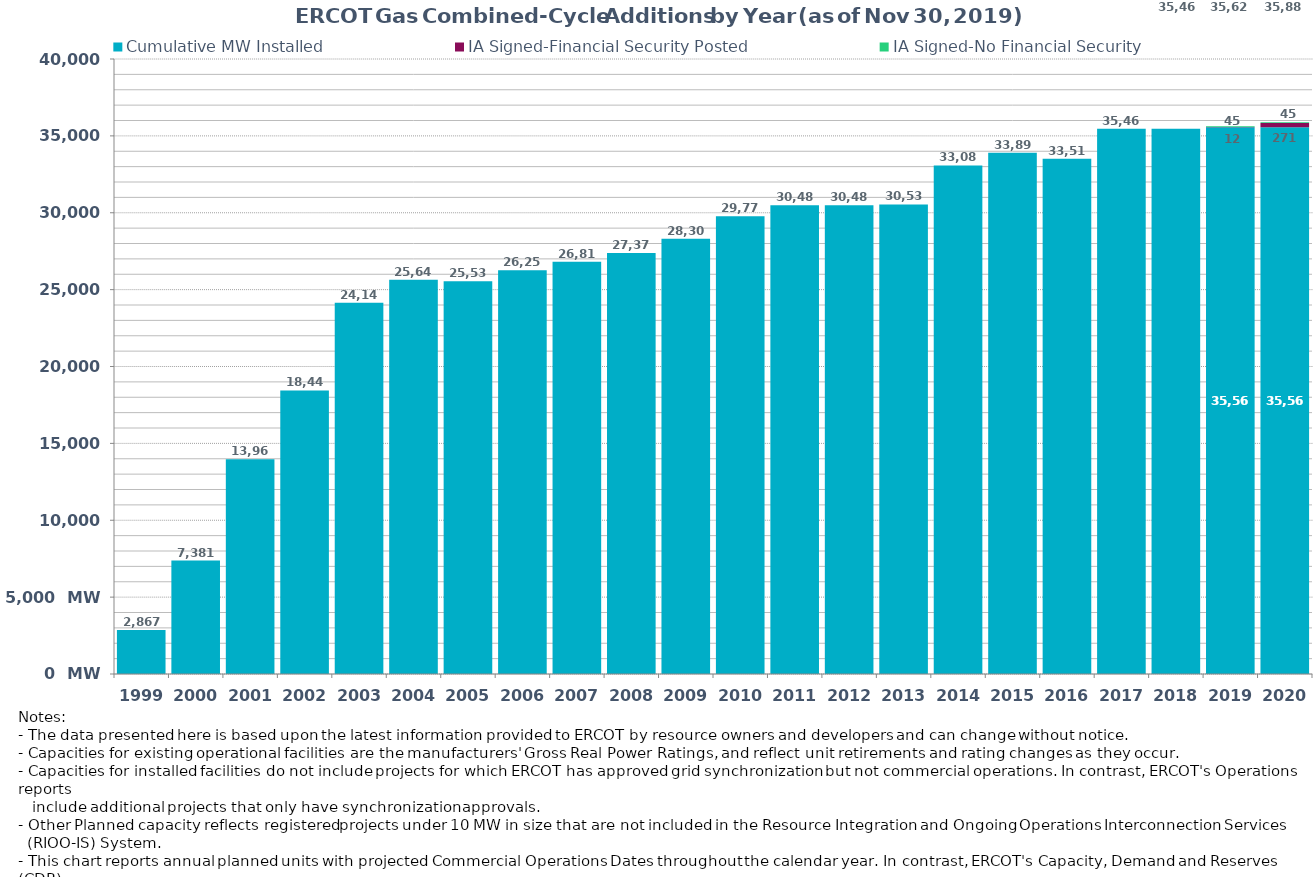
| Category | Cumulative MW Installed | IA Signed-Financial Security Posted  | IA Signed-No Financial Security  | Other Planned | Cumulative Installed and Planned |
|---|---|---|---|---|---|
| 1999.0 | 2867 | 0 | 0 | 0 | 2867 |
| 2000.0 | 7381 | 0 | 0 | 0 | 7381 |
| 2001.0 | 13967 | 0 | 0 | 0 | 13967 |
| 2002.0 | 18443 | 0 | 0 | 0 | 18443 |
| 2003.0 | 24141 | 0 | 0 | 0 | 24141 |
| 2004.0 | 25641 | 0 | 0 | 0 | 25641 |
| 2005.0 | 25539 | 0 | 0 | 0 | 25539 |
| 2006.0 | 26258 | 0 | 0 | 0 | 26258 |
| 2007.0 | 26815 | 0 | 0 | 0 | 26815 |
| 2008.0 | 27376 | 0 | 0 | 0 | 27376 |
| 2009.0 | 28309 | 0 | 0 | 0 | 28309 |
| 2010.0 | 29770 | 0 | 0 | 0 | 29770 |
| 2011.0 | 30488 | 0 | 0 | 0 | 30488 |
| 2012.0 | 30488 | 0 | 0 | 0 | 30488 |
| 2013.0 | 30538 | 0 | 0 | 0 | 30538 |
| 2014.0 | 33080 | 0 | 0 | 0 | 33080 |
| 2015.0 | 33897 | 0 | 0 | 0 | 33897 |
| 2016.0 | 33515 | 0 | 0 | 0 | 33515 |
| 2017.0 | 35465 | 0 | 0 | 0 | 35465 |
| 2018.0 | 35465 | 0 | 0 | 0 | 35465 |
| 2019.0 | 35564 | 12 | 45 | 0 | 35621 |
| 2020.0 | 35564 | 271 | 45 | 0 | 35880 |